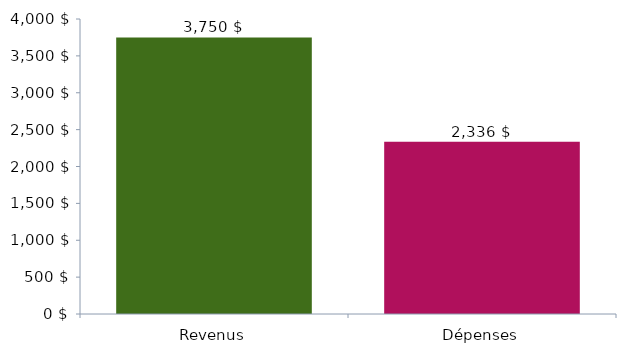
| Category | DonnéesGraphique |
|---|---|
| 0 | 3750 |
| 1 | 2336 |